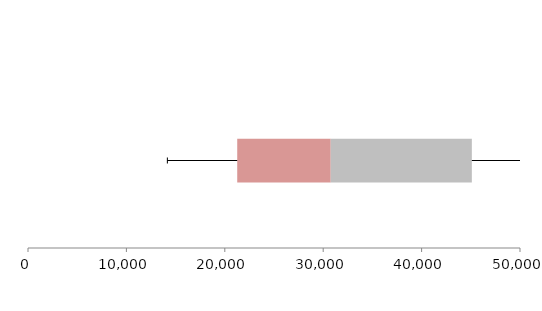
| Category | Series 1 | Series 2 | Series 3 |
|---|---|---|---|
| 0 | 21262.587 | 9502.49 | 14340.834 |